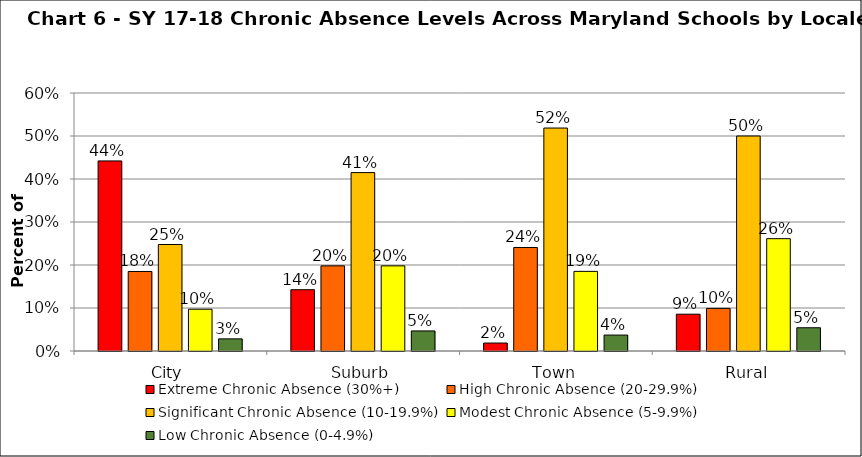
| Category | Extreme Chronic Absence (30%+) | High Chronic Absence (20-29.9%) | Significant Chronic Absence (10-19.9%) | Modest Chronic Absence (5-9.9%) | Low Chronic Absence (0-4.9%) |
|---|---|---|---|---|---|
| 0 | 0.442 | 0.185 | 0.248 | 0.097 | 0.028 |
| 1 | 0.142 | 0.198 | 0.415 | 0.198 | 0.047 |
| 2 | 0.019 | 0.241 | 0.519 | 0.185 | 0.037 |
| 3 | 0.086 | 0.099 | 0.5 | 0.261 | 0.054 |